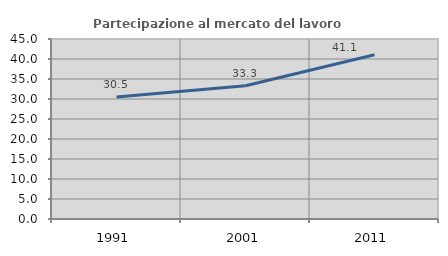
| Category | Partecipazione al mercato del lavoro  femminile |
|---|---|
| 1991.0 | 30.502 |
| 2001.0 | 33.333 |
| 2011.0 | 41.083 |